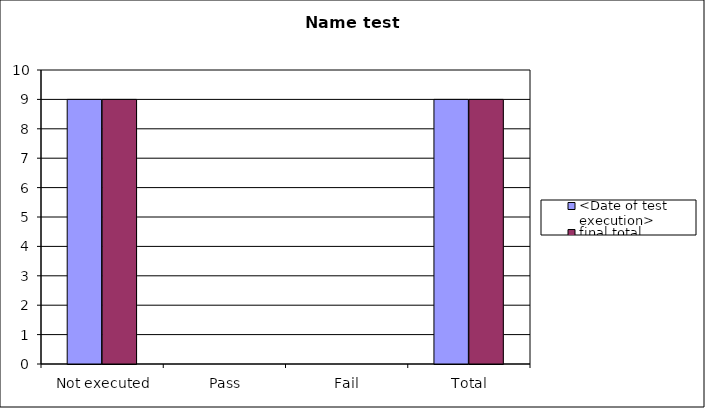
| Category | <Date of test execution> | final total |
|---|---|---|
|  Not executed | 9 | 9 |
|  Pass | 0 | 0 |
|  Fail | 0 | 0 |
|  Total | 9 | 9 |